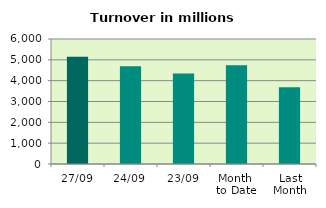
| Category | Series 0 |
|---|---|
| 27/09 | 5149.947 |
| 24/09 | 4690.749 |
| 23/09 | 4348.652 |
| Month 
to Date | 4735.744 |
| Last
Month | 3679.291 |